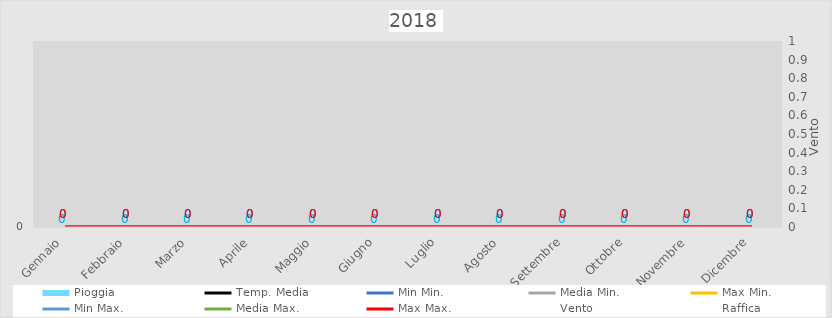
| Category | Pioggia |
|---|---|
| Gennaio | 0 |
| Febbraio | 0 |
| Marzo | 0 |
| Aprile | 0 |
| Maggio | 0 |
| Giugno | 0 |
| Luglio | 0 |
| Agosto | 0 |
| Settembre | 0 |
| Ottobre | 0 |
| Novembre | 0 |
| Dicembre | 0 |